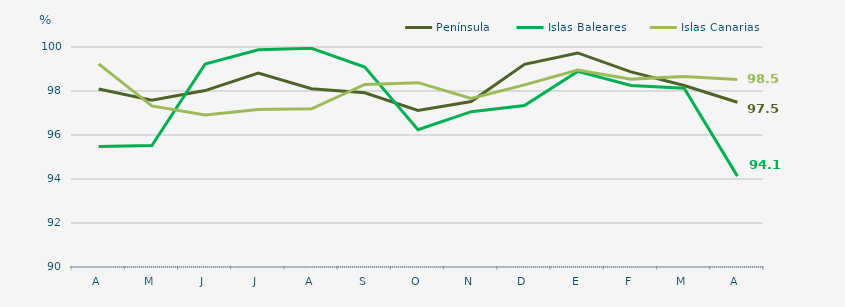
| Category | Península | Islas Baleares | Islas Canarias |
|---|---|---|---|
| A | 98.09 | 95.48 | 99.23 |
| M | 97.58 | 95.52 | 97.32 |
| J | 98.02 | 99.22 | 96.91 |
| J | 98.81 | 99.87 | 97.16 |
| A | 98.1 | 99.94 | 97.19 |
| S | 97.92 | 99.09 | 98.3 |
| O | 97.12 | 96.24 | 98.38 |
| N | 97.52 | 97.06 | 97.66 |
| D | 99.21 | 97.34 | 98.28 |
| E | 99.73 | 98.89 | 98.95 |
| F | 98.87 | 98.25 | 98.54 |
| M | 98.25 | 98.13 | 98.66 |
| A | 97.49 | 94.13 | 98.52 |